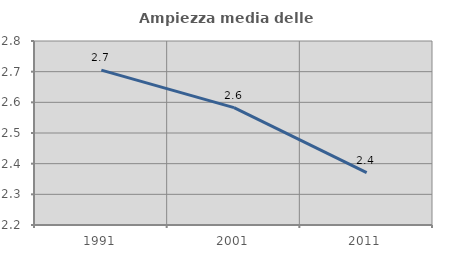
| Category | Ampiezza media delle famiglie |
|---|---|
| 1991.0 | 2.705 |
| 2001.0 | 2.583 |
| 2011.0 | 2.371 |